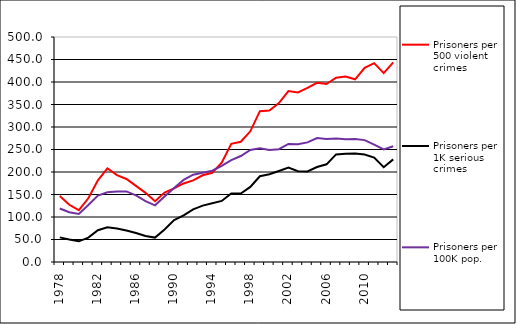
| Category | Prisoners per 500 violent crimes | Prisoners per 1K serious crimes | Prisoners per 100K pop. |
|---|---|---|---|
| 1978.0 | 146.672 | 54.741 | 118.892 |
| 1979.0 | 127.227 | 49.858 | 110.596 |
| 1980.0 | 115.169 | 45.968 | 106.945 |
| 1981.0 | 141.621 | 54.153 | 126.686 |
| 1982.0 | 181.555 | 70.721 | 147.562 |
| 1983.0 | 208.245 | 76.96 | 154.837 |
| 1984.0 | 192.945 | 74.386 | 156.841 |
| 1985.0 | 184.438 | 70.161 | 156.929 |
| 1986.0 | 169.264 | 64.367 | 147.95 |
| 1987.0 | 153.698 | 57.637 | 135.104 |
| 1988.0 | 134.986 | 54.226 | 125.915 |
| 1989.0 | 154.23 | 72.149 | 145.516 |
| 1990.0 | 163.765 | 93.106 | 164.28 |
| 1991.0 | 174.573 | 103.786 | 182.463 |
| 1992.0 | 181.376 | 117.074 | 193.906 |
| 1993.0 | 192.659 | 125.344 | 198.268 |
| 1994.0 | 198.283 | 130.345 | 202.751 |
| 1995.0 | 220.684 | 135.663 | 213.736 |
| 1996.0 | 262.543 | 152.084 | 226.405 |
| 1997.0 | 267.198 | 152.251 | 235.544 |
| 1998.0 | 290.422 | 166.942 | 248.919 |
| 1999.0 | 335.191 | 190.63 | 252.903 |
| 2000.0 | 336.561 | 194.861 | 248.824 |
| 2001.0 | 353.279 | 202.202 | 250.609 |
| 2002.0 | 379.746 | 209.743 | 262.434 |
| 2003.0 | 376.927 | 201.602 | 261.543 |
| 2004.0 | 386.85 | 201.349 | 265.875 |
| 2005.0 | 398.252 | 210.993 | 275.275 |
| 2006.0 | 395.543 | 217.056 | 273.351 |
| 2007.0 | 409.468 | 239.077 | 274.518 |
| 2008.0 | 412.3 | 240.634 | 273.009 |
| 2009.0 | 406.01 | 241.177 | 273.086 |
| 2010.0 | 431.544 | 238.799 | 270.829 |
| 2011.0 | 441.842 | 232.138 | 260.989 |
| 2012.0 | 419.744 | 210.597 | 250.228 |
| 2013.0 | 443.727 | 228.014 | 257.351 |